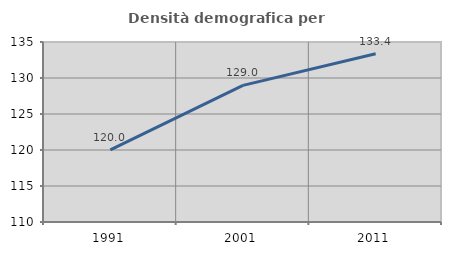
| Category | Densità demografica |
|---|---|
| 1991.0 | 120.02 |
| 2001.0 | 128.981 |
| 2011.0 | 133.363 |